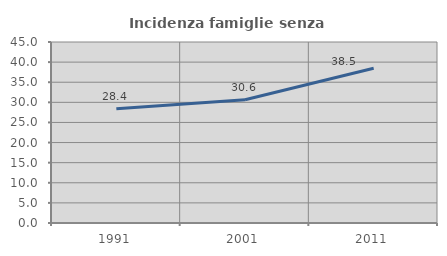
| Category | Incidenza famiglie senza nuclei |
|---|---|
| 1991.0 | 28.396 |
| 2001.0 | 30.623 |
| 2011.0 | 38.48 |